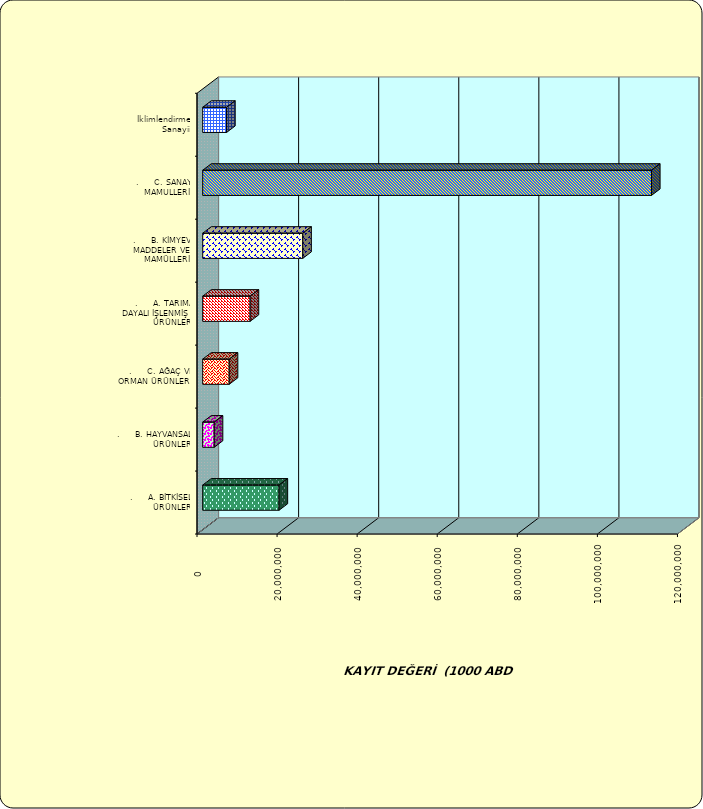
| Category | Series 0 |
|---|---|
| .     A. BİTKİSEL ÜRÜNLER | 19071102.584 |
| .     B. HAYVANSAL ÜRÜNLER | 2874056.812 |
| .     C. AĞAÇ VE ORMAN ÜRÜNLERİ | 6621359.616 |
| .     A. TARIMA DAYALI İŞLENMİŞ ÜRÜNLER | 11848363.706 |
| .     B. KİMYEVİ MADDELER VE MAMÜLLERİ | 24991733.821 |
| .     C. SANAYİ MAMULLERİ | 112088420.473 |
|  İklimlendirme Sanayii | 5969527.204 |